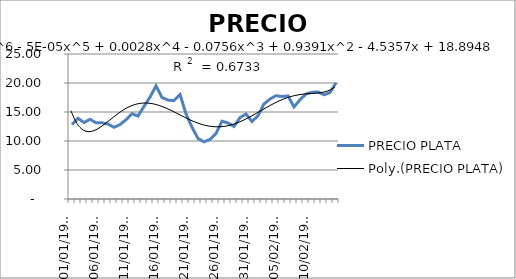
| Category | PRECIO PLATA |
|---|---|
| 01/01/1900 | 12.84 |
| 02/01/1900 | 13.91 |
| 03/01/1900 | 13.18 |
| 04/01/1900 | 13.74 |
| 05/01/1900 | 13.14 |
| 06/01/1900 | 13.14 |
| 07/01/1900 | 12.91 |
| 08/01/1900 | 12.36 |
| 09/01/1900 | 12.83 |
| 10/01/1900 | 13.67 |
| 11/01/1900 | 14.7 |
| 12/01/1900 | 14.3 |
| 13/01/1900 | 15.96 |
| 14/01/1900 | 17.56 |
| 15/01/1900 | 19.51 |
| 16/01/1900 | 17.5 |
| 17/01/1900 | 17.05 |
| 18/01/1900 | 16.97 |
| 19/01/1900 | 18.03 |
| 20/01/1900 | 14.69 |
| 21/01/1900 | 12.37 |
| 22/01/1900 | 10.44 |
| 23/01/1900 | 9.86 |
| 24/01/1900 | 10.28 |
| 25/01/1900 | 11.29 |
| 26/01/1900 | 13.41 |
| 27/01/1900 | 13.11 |
| 28/01/1900 | 12.51 |
| 29/01/1900 | 14.03 |
| 30/01/1900 | 14.65 |
| 31/01/1900 | 13.36 |
| 01/02/1900 | 14.35 |
| 02/02/1900 | 16.39 |
| 03/02/1900 | 17.24 |
| 04/02/1900 | 17.81 |
| 05/02/1900 | 17.67 |
| 06/02/1900 | 17.78 |
| 07/02/1900 | 15.87 |
| 08/02/1900 | 17.11 |
| 09/02/1900 | 18.1 |
| 10/02/1900 | 18.41 |
| 11/02/1900 | 18.45 |
| 12/02/1900 | 17.963 |
| 13/02/1900 | 18.36 |
| 14/02/1900 | 20.02 |